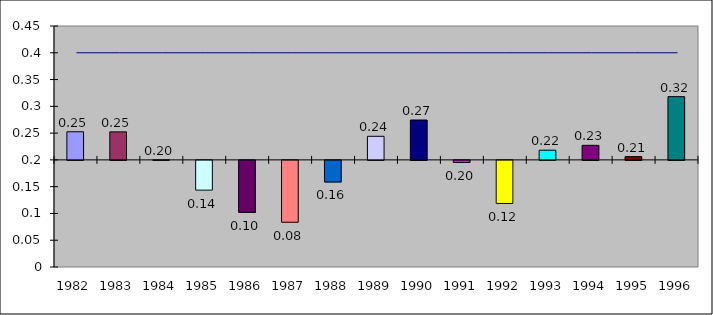
| Category | Series 1 |
|---|---|
| 1982.0 | 0.253 |
| 1983.0 | 0.252 |
| 1984.0 | 0.2 |
| 1985.0 | 0.144 |
| 1986.0 | 0.103 |
| 1987.0 | 0.085 |
| 1988.0 | 0.16 |
| 1989.0 | 0.244 |
| 1990.0 | 0.274 |
| 1991.0 | 0.196 |
| 1992.0 | 0.12 |
| 1993.0 | 0.218 |
| 1994.0 | 0.227 |
| 1995.0 | 0.206 |
| 1996.0 | 0.318 |